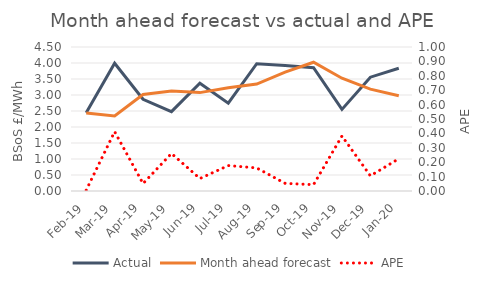
| Category | Actual | Month ahead forecast |
|---|---|---|
| Feb-19 | 2.449 | 2.436 |
| Mar-19 | 3.992 | 2.347 |
| Apr-19 | 2.867 | 3.015 |
| May-19 | 2.479 | 3.125 |
| Jun-19 | 3.366 | 3.075 |
| Jul-19 | 2.744 | 3.228 |
| Aug-19 | 3.978 | 3.341 |
| Sep-19 | 3.922 | 3.715 |
| Oct-19 | 3.854 | 4.023 |
| Nov-19 | 2.551 | 3.525 |
| Dec-19 | 3.556 | 3.182 |
| Jan-20 | 3.837 | 2.977 |